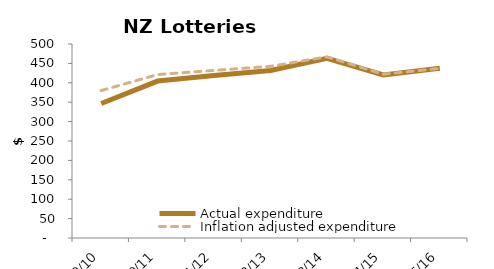
| Category | Actual expenditure | Inflation adjusted expenditure |
|---|---|---|
| 2009/10 | 346.622 | 380.054 |
| 2010/11 | 404.477 | 421.257 |
| 2011/12 | 418.739 | 432.004 |
| 2012/13 | 431.824 | 442.473 |
| 2013/14 | 463.06 | 466.935 |
| 2014/15 | 420.377 | 422.129 |
| 2015/16 | 437.262 | 437.262 |